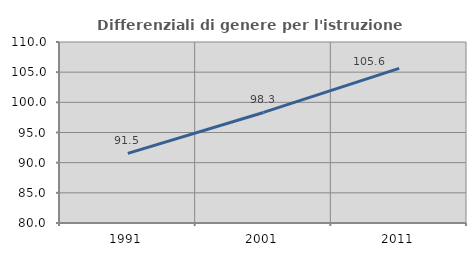
| Category | Differenziali di genere per l'istruzione superiore |
|---|---|
| 1991.0 | 91.541 |
| 2001.0 | 98.324 |
| 2011.0 | 105.623 |